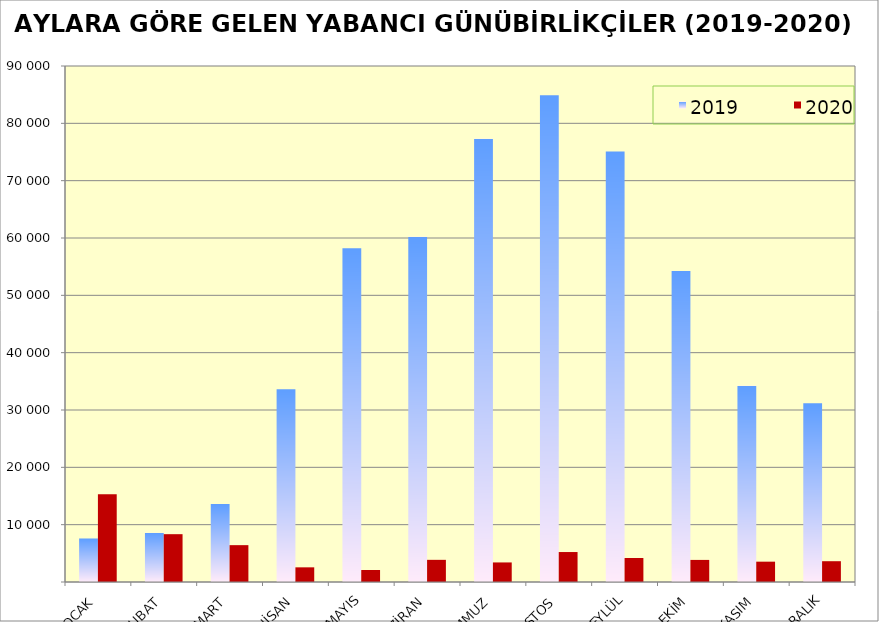
| Category | 2019 | 2020 |
|---|---|---|
| OCAK | 7589 | 15315 |
| ŞUBAT | 8565 | 8341 |
| MART | 13594 | 6427 |
| NİSAN | 33640 | 2557 |
| MAYIS | 58228 | 2090 |
| HAZİRAN | 60198 | 3865 |
| TEMMUZ | 77293 | 3412 |
| AĞUSTOS | 84888 | 5227 |
| EYLÜL | 75094 | 4182 |
| EKİM | 54225 | 3852 |
| KASIM | 34240 | 3546 |
| ARALIK | 31164 | 3627 |